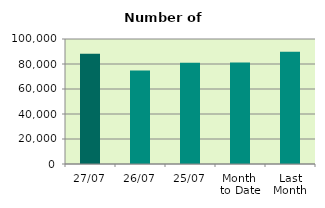
| Category | Series 0 |
|---|---|
| 27/07 | 88244 |
| 26/07 | 74824 |
| 25/07 | 80920 |
| Month 
to Date | 81111.895 |
| Last
Month | 89884.909 |